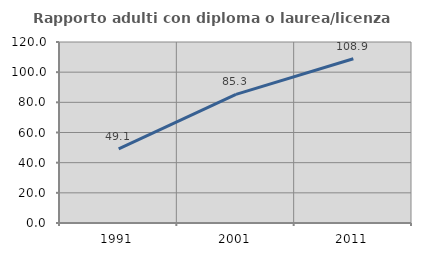
| Category | Rapporto adulti con diploma o laurea/licenza media  |
|---|---|
| 1991.0 | 49.074 |
| 2001.0 | 85.317 |
| 2011.0 | 108.922 |